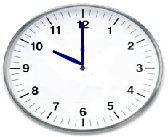
| Category | Series 0 |
|---|---|
| 0.0 | 0 |
| -0.23179596364169683 | 0.094 |
| -0.7794228634059949 | 0.45 |
| -0.19700268840168048 | 0.154 |
| 0.0 | 0 |
| -0.2246985115747917 | 0.11 |
| -0.7794228634059949 | 0.45 |
| -0.2072593931387604 | 0.14 |
| 0.0 | 0 |
| -0.017449748351250367 | 0.5 |
| 8.882326298087495e-17 | 1.45 |
| -0.008726203218641738 | 0.5 |
| 0.0 | 0 |
| 0.01744974835125054 | 0.5 |
| 8.882326298087495e-17 | 1.45 |
| 0.0087262032186418 | 0.5 |
| 0.0 | 0 |